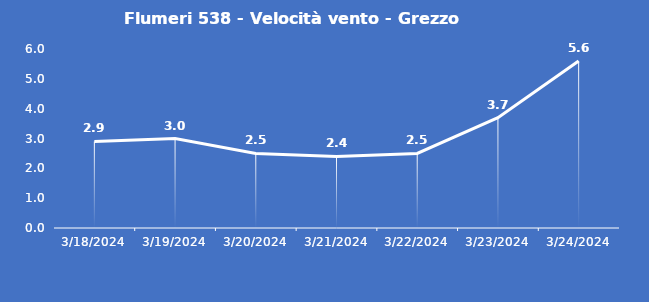
| Category | Flumeri 538 - Velocità vento - Grezzo (m/s) |
|---|---|
| 3/18/24 | 2.9 |
| 3/19/24 | 3 |
| 3/20/24 | 2.5 |
| 3/21/24 | 2.4 |
| 3/22/24 | 2.5 |
| 3/23/24 | 3.7 |
| 3/24/24 | 5.6 |